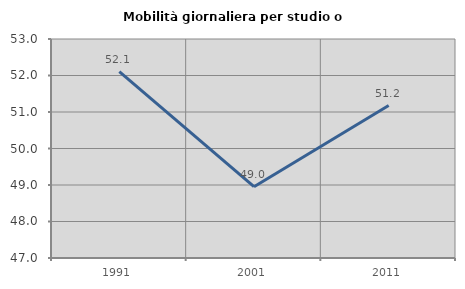
| Category | Mobilità giornaliera per studio o lavoro |
|---|---|
| 1991.0 | 52.105 |
| 2001.0 | 48.953 |
| 2011.0 | 51.176 |